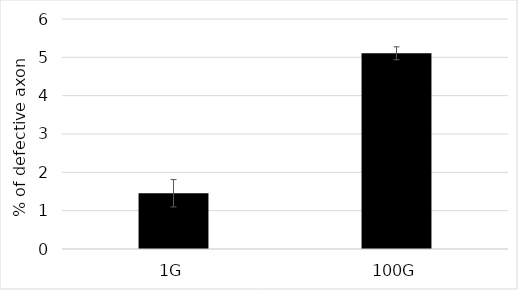
| Category | Series 0 |
|---|---|
| 1G | 1.454 |
| 100G | 5.106 |